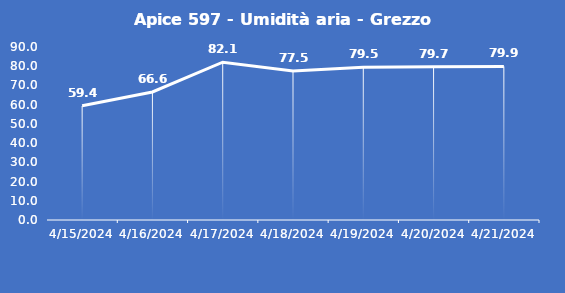
| Category | Apice 597 - Umidità aria - Grezzo (%) |
|---|---|
| 4/15/24 | 59.4 |
| 4/16/24 | 66.6 |
| 4/17/24 | 82.1 |
| 4/18/24 | 77.5 |
| 4/19/24 | 79.5 |
| 4/20/24 | 79.7 |
| 4/21/24 | 79.9 |